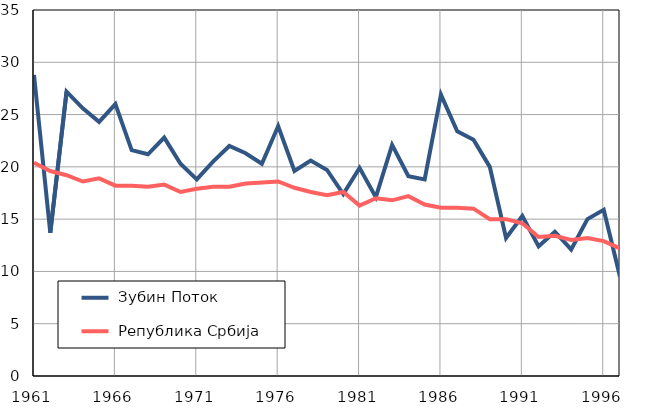
| Category |  Зубин Поток |  Република Србија |
|---|---|---|
| 1961.0 | 28.8 | 20.4 |
| 1962.0 | 13.7 | 19.6 |
| 1963.0 | 27.2 | 19.2 |
| 1964.0 | 25.6 | 18.6 |
| 1965.0 | 24.3 | 18.9 |
| 1966.0 | 26 | 18.2 |
| 1967.0 | 21.6 | 18.2 |
| 1968.0 | 21.2 | 18.1 |
| 1969.0 | 22.8 | 18.3 |
| 1970.0 | 20.3 | 17.6 |
| 1971.0 | 18.8 | 17.9 |
| 1972.0 | 20.5 | 18.1 |
| 1973.0 | 22 | 18.1 |
| 1974.0 | 21.3 | 18.4 |
| 1975.0 | 20.3 | 18.5 |
| 1976.0 | 23.9 | 18.6 |
| 1977.0 | 19.6 | 18 |
| 1978.0 | 20.6 | 17.6 |
| 1979.0 | 19.7 | 17.3 |
| 1980.0 | 17.4 | 17.6 |
| 1981.0 | 19.9 | 16.3 |
| 1982.0 | 17.1 | 17 |
| 1983.0 | 22.1 | 16.8 |
| 1984.0 | 19.1 | 17.2 |
| 1985.0 | 18.8 | 16.4 |
| 1986.0 | 26.9 | 16.1 |
| 1987.0 | 23.4 | 16.1 |
| 1988.0 | 22.6 | 16 |
| 1989.0 | 20 | 15 |
| 1990.0 | 13.2 | 15 |
| 1991.0 | 15.3 | 14.6 |
| 1992.0 | 12.4 | 13.3 |
| 1993.0 | 13.8 | 13.4 |
| 1994.0 | 12.1 | 13 |
| 1995.0 | 15 | 13.2 |
| 1996.0 | 15.9 | 12.9 |
| 1997.0 | 9.5 | 12.2 |